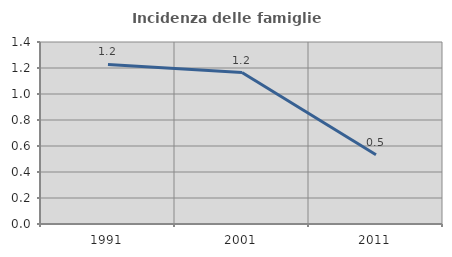
| Category | Incidenza delle famiglie numerose |
|---|---|
| 1991.0 | 1.227 |
| 2001.0 | 1.165 |
| 2011.0 | 0.533 |